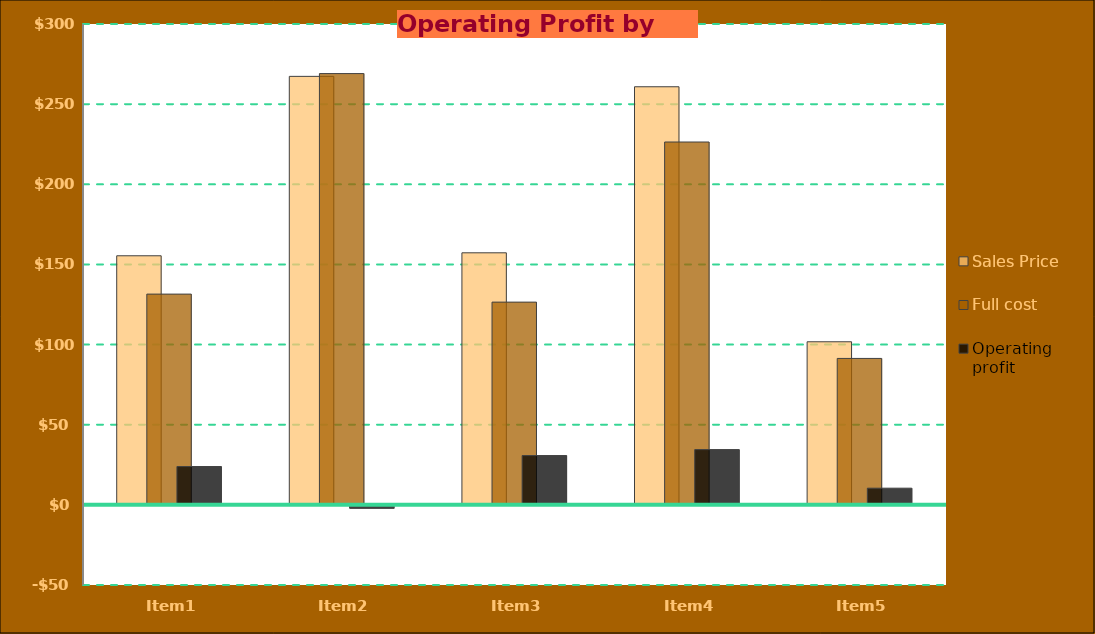
| Category | Sales Price | Full cost | Operating profit |
|---|---|---|---|
| Item1 | 155.4 | 131.49 | 23.91 |
| Item2 | 267.325 | 269.06 | -1.735 |
| Item3 | 157.25 | 126.49 | 30.76 |
| Item4 | 260.85 | 226.38 | 34.47 |
| Item5 | 101.75 | 91.35 | 10.4 |